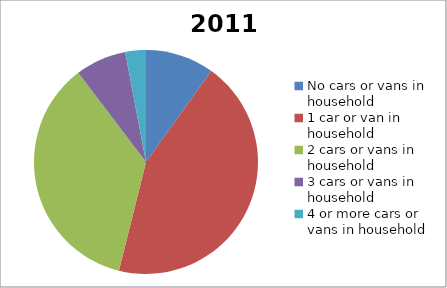
| Category | 2011 |
|---|---|
| No cars or vans in household | 163 |
| 1 car or van in household | 723 |
| 2 cars or vans in household | 588 |
| 3 cars or vans in household | 121 |
| 4 or more cars or vans in household | 49 |